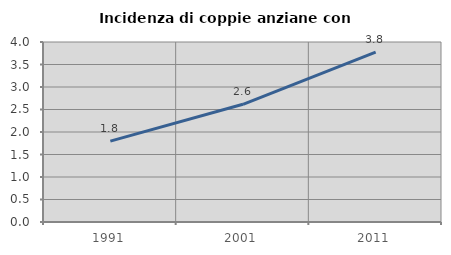
| Category | Incidenza di coppie anziane con figli |
|---|---|
| 1991.0 | 1.796 |
| 2001.0 | 2.616 |
| 2011.0 | 3.774 |